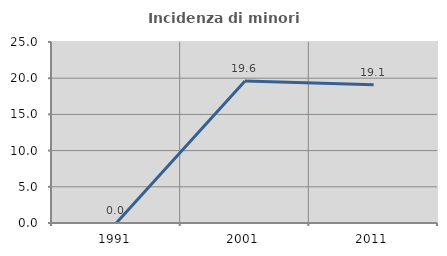
| Category | Incidenza di minori stranieri |
|---|---|
| 1991.0 | 0 |
| 2001.0 | 19.608 |
| 2011.0 | 19.084 |